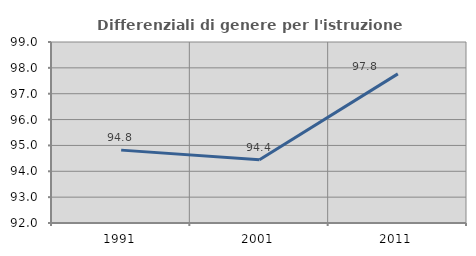
| Category | Differenziali di genere per l'istruzione superiore |
|---|---|
| 1991.0 | 94.818 |
| 2001.0 | 94.446 |
| 2011.0 | 97.767 |